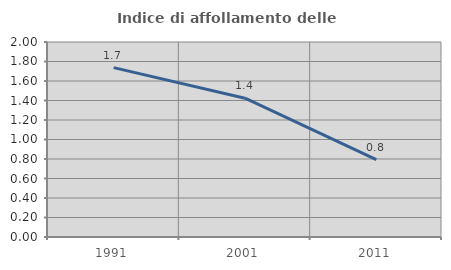
| Category | Indice di affollamento delle abitazioni  |
|---|---|
| 1991.0 | 1.737 |
| 2001.0 | 1.423 |
| 2011.0 | 0.794 |